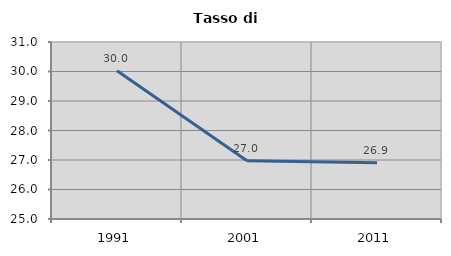
| Category | Tasso di disoccupazione   |
|---|---|
| 1991.0 | 30.028 |
| 2001.0 | 26.974 |
| 2011.0 | 26.908 |